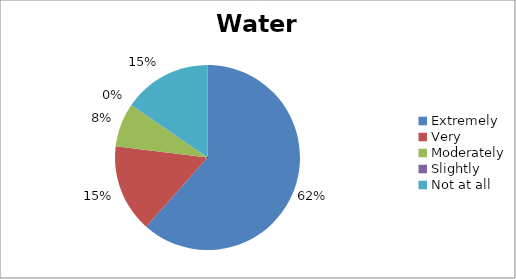
| Category | Water |
|---|---|
| Extremely | 8 |
| Very | 2 |
| Moderately | 1 |
| Slightly | 0 |
| Not at all | 2 |